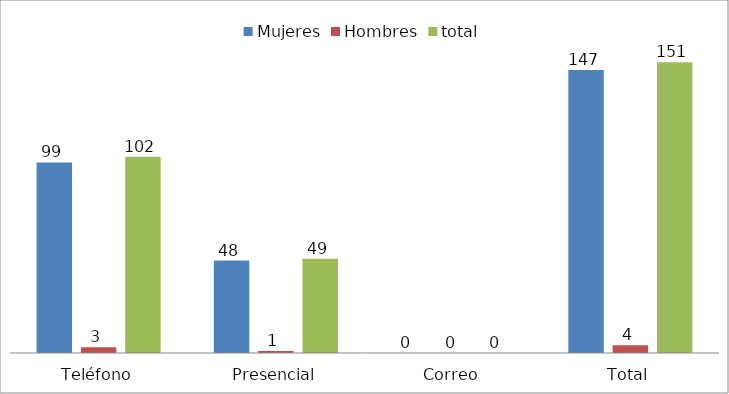
| Category | Mujeres | Hombres | total |
|---|---|---|---|
| Teléfono | 99 | 3 | 102 |
| Presencial | 48 | 1 | 49 |
| Correo | 0 | 0 | 0 |
| Total | 147 | 4 | 151 |